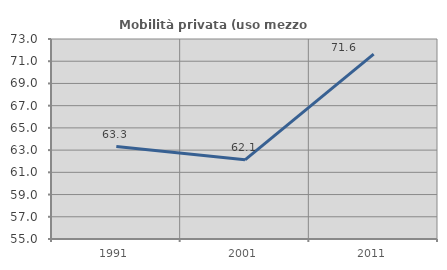
| Category | Mobilità privata (uso mezzo privato) |
|---|---|
| 1991.0 | 63.323 |
| 2001.0 | 62.123 |
| 2011.0 | 71.636 |